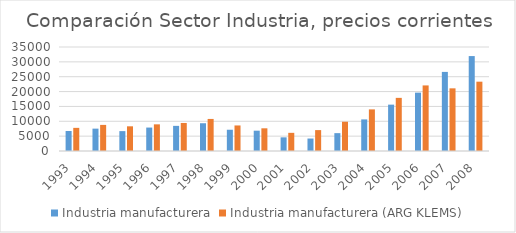
| Category | Industria manufacturera | Industria manufacturera (ARG KLEMS) |
|---|---|---|
| 1993.0 | 6729.159 | 7786.581 |
| 1994.0 | 7525.838 | 8782.882 |
| 1995.0 | 6690.565 | 8309.104 |
| 1996.0 | 7889.074 | 8970.778 |
| 1997.0 | 8457.166 | 9434.513 |
| 1998.0 | 9342.018 | 10789.309 |
| 1999.0 | 7155.552 | 8598.062 |
| 2000.0 | 6839.468 | 7636.959 |
| 2001.0 | 4595.842 | 6113.709 |
| 2002.0 | 4195.841 | 7034.031 |
| 2003.0 | 6012.47 | 9849.035 |
| 2004.0 | 10631.181 | 14005.01 |
| 2005.0 | 15601.932 | 17880.946 |
| 2006.0 | 19640.393 | 22069.825 |
| 2007.0 | 26619.453 | 21087.274 |
| 2008.0 | 31947.584 | 23329.58 |